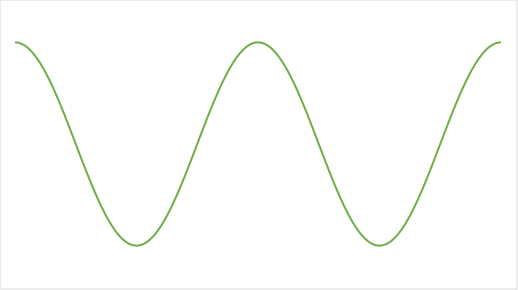
| Category | Series 0 |
|---|---|
| 0.0 | 1 |
| 0.01 | 0.998 |
| 0.02 | 0.992 |
| 0.03 | 0.982 |
| 0.04 | 0.969 |
| 0.05 | 0.951 |
| 0.06 | 0.93 |
| 0.07 | 0.905 |
| 0.08 | 0.876 |
| 0.09 | 0.844 |
| 0.1 | 0.809 |
| 0.11 | 0.771 |
| 0.12 | 0.729 |
| 0.13 | 0.685 |
| 0.14 | 0.637 |
| 0.15 | 0.588 |
| 0.16 | 0.536 |
| 0.17 | 0.482 |
| 0.18 | 0.426 |
| 0.19 | 0.368 |
| 0.2 | 0.309 |
| 0.21 | 0.249 |
| 0.22 | 0.187 |
| 0.23 | 0.125 |
| 0.24 | 0.063 |
| 0.25 | 0 |
| 0.26 | -0.063 |
| 0.27 | -0.125 |
| 0.28 | -0.187 |
| 0.29 | -0.249 |
| 0.3 | -0.309 |
| 0.31 | -0.368 |
| 0.32 | -0.426 |
| 0.33 | -0.482 |
| 0.34 | -0.536 |
| 0.35 | -0.588 |
| 0.36 | -0.637 |
| 0.37 | -0.685 |
| 0.38 | -0.729 |
| 0.39 | -0.771 |
| 0.4 | -0.809 |
| 0.41 | -0.844 |
| 0.42 | -0.876 |
| 0.43 | -0.905 |
| 0.44 | -0.93 |
| 0.45 | -0.951 |
| 0.46 | -0.969 |
| 0.47 | -0.982 |
| 0.48 | -0.992 |
| 0.49 | -0.998 |
| 0.5 | -1 |
| 0.51 | -0.998 |
| 0.52 | -0.992 |
| 0.53 | -0.982 |
| 0.54 | -0.969 |
| 0.55 | -0.951 |
| 0.56 | -0.93 |
| 0.57 | -0.905 |
| 0.58 | -0.876 |
| 0.59 | -0.844 |
| 0.6 | -0.809 |
| 0.61 | -0.771 |
| 0.62 | -0.729 |
| 0.63 | -0.685 |
| 0.64 | -0.637 |
| 0.65 | -0.588 |
| 0.66 | -0.536 |
| 0.67 | -0.482 |
| 0.68 | -0.426 |
| 0.69 | -0.368 |
| 0.7 | -0.309 |
| 0.71 | -0.249 |
| 0.72 | -0.187 |
| 0.73 | -0.125 |
| 0.74 | -0.063 |
| 0.75 | 0 |
| 0.76 | 0.063 |
| 0.77 | 0.125 |
| 0.78 | 0.187 |
| 0.79 | 0.249 |
| 0.8 | 0.309 |
| 0.81 | 0.368 |
| 0.82 | 0.426 |
| 0.83 | 0.482 |
| 0.84 | 0.536 |
| 0.85 | 0.588 |
| 0.86 | 0.637 |
| 0.87 | 0.685 |
| 0.88 | 0.729 |
| 0.89 | 0.771 |
| 0.9 | 0.809 |
| 0.91 | 0.844 |
| 0.92 | 0.876 |
| 0.93 | 0.905 |
| 0.94 | 0.93 |
| 0.95 | 0.951 |
| 0.96 | 0.969 |
| 0.97 | 0.982 |
| 0.98 | 0.992 |
| 0.99 | 0.998 |
| 1.0 | 1 |
| 1.01 | 0.998 |
| 1.02 | 0.992 |
| 1.03 | 0.982 |
| 1.04 | 0.969 |
| 1.05 | 0.951 |
| 1.06 | 0.93 |
| 1.07 | 0.905 |
| 1.08 | 0.876 |
| 1.09 | 0.844 |
| 1.1 | 0.809 |
| 1.11 | 0.771 |
| 1.12 | 0.729 |
| 1.13 | 0.685 |
| 1.14 | 0.637 |
| 1.15 | 0.588 |
| 1.16 | 0.536 |
| 1.17 | 0.482 |
| 1.18 | 0.426 |
| 1.19 | 0.368 |
| 1.2 | 0.309 |
| 1.21 | 0.249 |
| 1.22 | 0.187 |
| 1.23 | 0.125 |
| 1.24 | 0.063 |
| 1.25 | 0 |
| 1.26 | -0.063 |
| 1.27 | -0.125 |
| 1.28 | -0.187 |
| 1.29 | -0.249 |
| 1.3 | -0.309 |
| 1.31 | -0.368 |
| 1.32 | -0.426 |
| 1.33 | -0.482 |
| 1.34 | -0.536 |
| 1.35 | -0.588 |
| 1.36 | -0.637 |
| 1.37 | -0.685 |
| 1.38 | -0.729 |
| 1.39 | -0.771 |
| 1.4 | -0.809 |
| 1.41 | -0.844 |
| 1.42 | -0.876 |
| 1.43 | -0.905 |
| 1.44 | -0.93 |
| 1.45 | -0.951 |
| 1.46 | -0.969 |
| 1.47 | -0.982 |
| 1.48 | -0.992 |
| 1.49 | -0.998 |
| 1.5 | -1 |
| 1.51 | -0.998 |
| 1.52 | -0.992 |
| 1.53 | -0.982 |
| 1.54 | -0.969 |
| 1.55 | -0.951 |
| 1.56 | -0.93 |
| 1.57 | -0.905 |
| 1.58 | -0.876 |
| 1.59 | -0.844 |
| 1.6 | -0.809 |
| 1.61 | -0.771 |
| 1.62 | -0.729 |
| 1.63 | -0.685 |
| 1.64 | -0.637 |
| 1.65 | -0.588 |
| 1.66 | -0.536 |
| 1.67 | -0.482 |
| 1.68 | -0.426 |
| 1.69 | -0.368 |
| 1.7 | -0.309 |
| 1.71 | -0.249 |
| 1.72 | -0.187 |
| 1.73 | -0.125 |
| 1.74 | -0.063 |
| 1.75 | 0 |
| 1.76 | 0.063 |
| 1.77 | 0.125 |
| 1.78 | 0.187 |
| 1.79 | 0.249 |
| 1.8 | 0.309 |
| 1.81 | 0.368 |
| 1.82 | 0.426 |
| 1.83 | 0.482 |
| 1.84 | 0.536 |
| 1.85 | 0.588 |
| 1.86 | 0.637 |
| 1.87 | 0.685 |
| 1.88 | 0.729 |
| 1.89 | 0.771 |
| 1.9 | 0.809 |
| 1.91 | 0.844 |
| 1.92 | 0.876 |
| 1.93 | 0.905 |
| 1.94 | 0.93 |
| 1.95 | 0.951 |
| 1.96 | 0.969 |
| 1.97 | 0.982 |
| 1.98 | 0.992 |
| 1.99 | 0.998 |
| 2.0 | 1 |